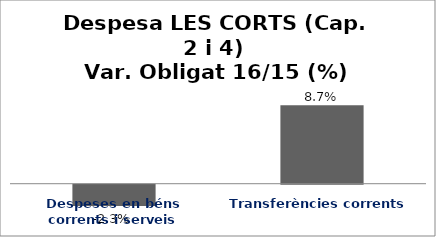
| Category | Series 0 |
|---|---|
| Despeses en béns corrents i serveis | -0.023 |
| Transferències corrents | 0.087 |